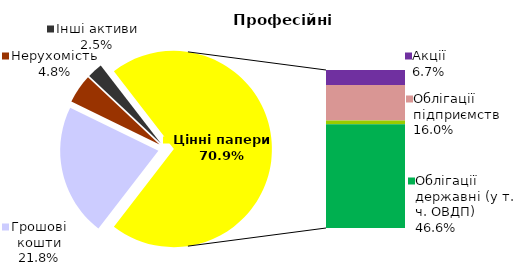
| Category | Професійні |
|---|---|
| Грошові кошти | 31.977 |
| Банківські метали | 0 |
| Нерухомість | 7.006 |
| Інші активи | 3.725 |
| Акції | 9.868 |
| Облігації підприємств | 23.446 |
| Муніципальні облігації | 2.377 |
| Облігації державні (у т. ч. ОВДП) | 68.48 |